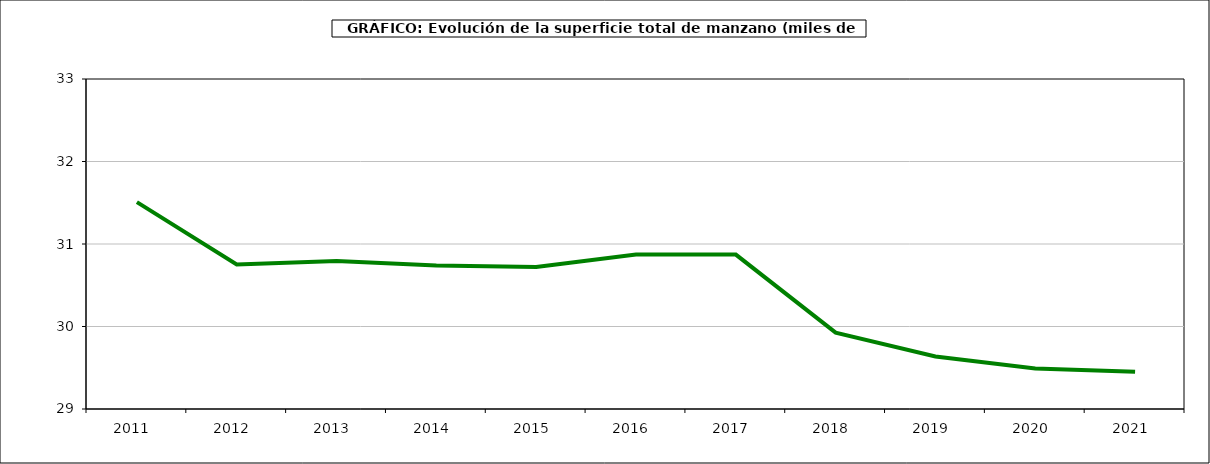
| Category | superficie manzano |
|---|---|
| 2011.0 | 31.507 |
| 2012.0 | 30.753 |
| 2013.0 | 30.794 |
| 2014.0 | 30.739 |
| 2015.0 | 30.721 |
| 2016.0 | 30.872 |
| 2017.0 | 30.872 |
| 2018.0 | 29.925 |
| 2019.0 | 29.637 |
| 2020.0 | 29.49 |
| 2021.0 | 29.451 |